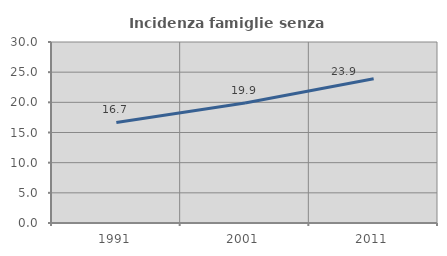
| Category | Incidenza famiglie senza nuclei |
|---|---|
| 1991.0 | 16.658 |
| 2001.0 | 19.899 |
| 2011.0 | 23.921 |